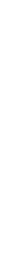
| Category | 18 grudnia  2019 r.
18 December  2019 |
|---|---|
| 0.0 | 17936.4 |
| 1.0 | 18035.6 |
| 2.0 | 18219 |
| 3.0 | 18268.8 |
| 4.0 | 18239.7 |
| 5.0 | 18758.5 |
| 6.0 | 19714.8 |
| 7.0 | 22025.8 |
| 8.0 | 22918.2 |
| 9.0 | 23404.3 |
| 10.0 | 22741.6 |
| 11.0 | 23159 |
| 12.0 | 23130.8 |
| 13.0 | 23071.3 |
| 14.0 | 23087.8 |
| 15.0 | 23316.5 |
| 16.0 | 24037.9 |
| 17.0 | 24492.9 |
| 18.0 | 24163.4 |
| 19.0 | 23991.2 |
| 20.0 | 23697.9 |
| 21.0 | 22689.8 |
| 22.0 | 20616.7 |
| 23.0 | 19404.6 |
| 24.0 | 18162.5 |